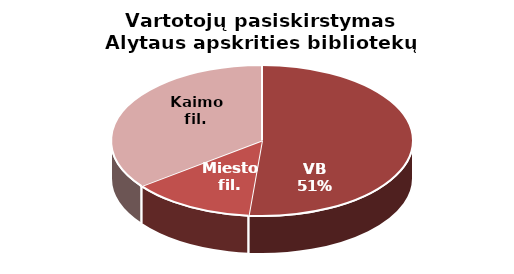
| Category | Vartotojų pasiskirstymas Alytaus apskrities bibliotekų padaliniuose |
|---|---|
| VB | 21845 |
| Miesto fil. | 5639 |
| Kaimo fil. | 15006 |